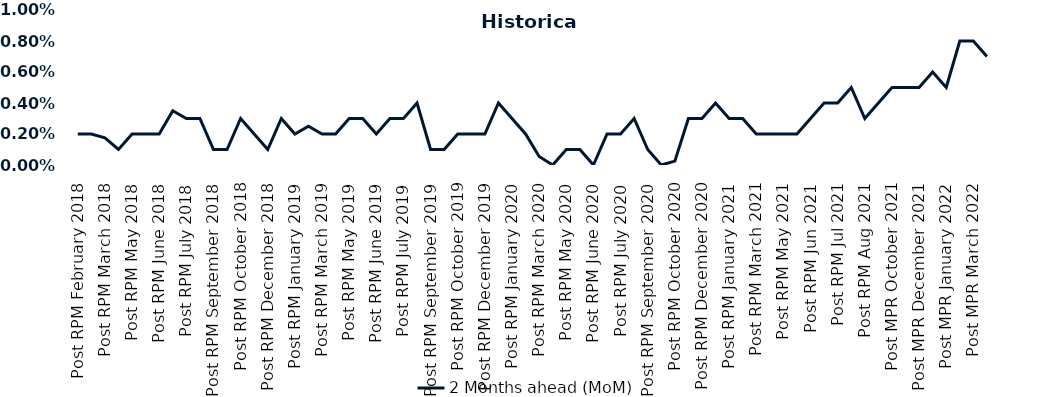
| Category | 2 Months ahead (MoM) |
|---|---|
| Post RPM February 2018 | 0.002 |
| Pre RPM March 2018 | 0.002 |
| Post RPM March 2018 | 0.002 |
| Pre RPM May 2018 | 0.001 |
| Post RPM May 2018 | 0.002 |
| Pre RPM June 2018 | 0.002 |
| Post RPM June 2018 | 0.002 |
| Pre RPM July 2018 | 0.004 |
| Post RPM July 2018 | 0.003 |
| Pre RPM September 2018 | 0.003 |
| Post RPM September 2018 | 0.001 |
| Pre RPM October 2018 | 0.001 |
| Post RPM October 2018 | 0.003 |
| Pre RPM December 2018 | 0.002 |
| Post RPM December 2018 | 0.001 |
| Pre RPM January 2019 | 0.003 |
| Post RPM January 2019 | 0.002 |
| Pre RPM March 2019 | 0.002 |
| Post RPM March 2019 | 0.002 |
| Pre RPM May 2019 | 0.002 |
| Post RPM May 2019 | 0.003 |
| Pre RPM June 2019 | 0.003 |
| Post RPM June 2019 | 0.002 |
| Pre RPM July 2019 | 0.003 |
| Post RPM July 2019 | 0.003 |
| Pre RPM September 2019 | 0.004 |
| Post RPM September 2019 | 0.001 |
| Pre RPM October 2019 | 0.001 |
| Post RPM October 2019 | 0.002 |
| Pre RPM December 2019 | 0.002 |
| Post RPM December 2019 | 0.002 |
| Pre RPM January 2020 | 0.004 |
| Post RPM January 2020 | 0.003 |
| Pre RPM March 2020 | 0.002 |
| Post RPM March 2020 | 0.001 |
| Pre RPM May 2020 | 0 |
| Post RPM May 2020 | 0.001 |
| Pre RPM June 2020 | 0.001 |
| Post RPM June 2020 | 0 |
| Pre RPM July 2020 | 0.002 |
| Post RPM July 2020 | 0.002 |
| Pre RPM September 2020 | 0.003 |
| Post RPM September 2020 | 0.001 |
| Pre RPM October 2020 | 0 |
| Post RPM October 2020 | 0 |
| Pre RPM December 2020 | 0.003 |
|  Post RPM December 2020 | 0.003 |
| Pre RPM January 2021 | 0.004 |
| Post RPM January 2021 | 0.003 |
|  Pre RPM March 2021 | 0.003 |
|  Post RPM March 2021 | 0.002 |
|  Pre RPM May 2021 | 0.002 |
|  Post RPM May 2021 | 0.002 |
|  Pre RPM Jun 2021 | 0.002 |
|   Post RPM Jun 2021 | 0.003 |
| Pre RPM Jul 2021 | 0.004 |
|  Post RPM Jul 2021 | 0.004 |
| Pre RPM Aug 2021 | 0.005 |
|  Post RPM Aug 2021 | 0.003 |
| Pre MPR October 2021 | 0.004 |
| Post MPR October 2021 | 0.005 |
| Pre MPR December 2021 | 0.005 |
| Post MPR December 2021 | 0.005 |
| Pre MPR January 2022 | 0.006 |
| Post MPR January 2022 | 0.005 |
| Pre MPR March 2022 | 0.008 |
| Post MPR March 2022 | 0.008 |
| Pre MPR May 2022 | 0.007 |